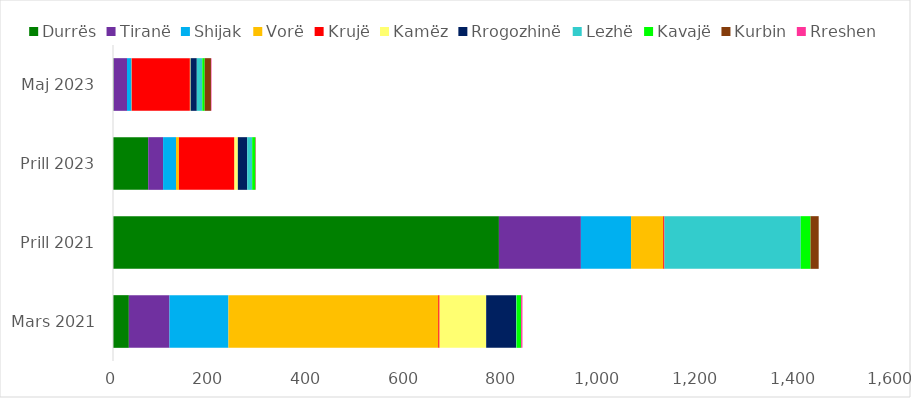
| Category | Durrës | Tiranë | Shijak | Vorë | Krujë | Kamëz | Rrogozhinë | Lezhë | Kavajë | Kurbin | Rreshen |
|---|---|---|---|---|---|---|---|---|---|---|---|
| Mars 2021 | 32.5 | 83.405 | 120.891 | 430.407 | 2.5 | 95.778 | 61.27 | 0.95 | 9.5 | 0 | 2.65 |
| Prill 2021 | 791.633 | 168.143 | 102.987 | 65.889 | 2.45 | 0 | 0 | 279.679 | 20.08 | 16.709 | 0 |
| Prill 2023 | 72.188 | 30.552 | 26.501 | 5.991 | 113.595 | 7.28 | 19.23 | 10.159 | 6.037 | 1.047 | 0 |
| Maj 2023 | 1.147 | 27.585 | 9.263 | 0.48 | 119.218 | 1.5 | 12.697 | 11.3 | 4.919 | 12.847 | 1.047 |